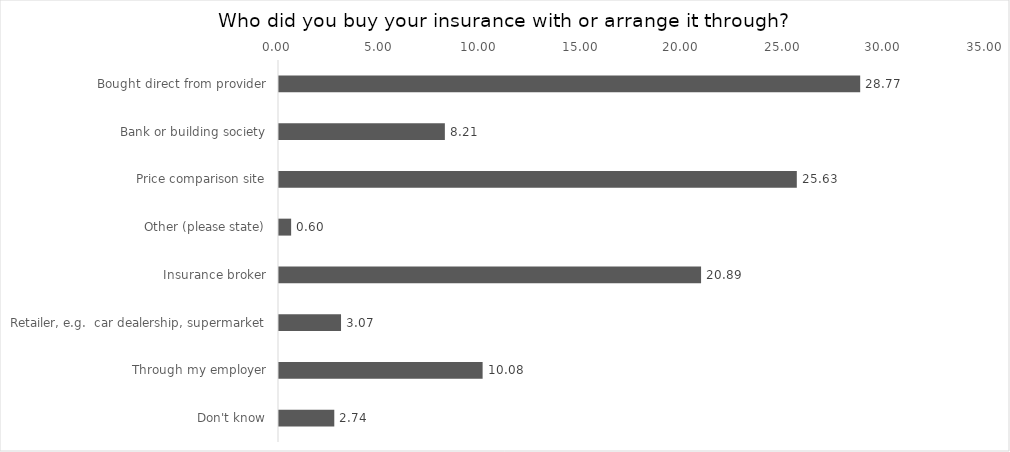
| Category | % of Respondents |
|---|---|
| Bought direct from provider | 28.772 |
| Bank or building society | 8.211 |
| Price comparison site | 25.634 |
| Other (please state) | 0.601 |
| Insurance broker | 20.895 |
| Retailer, e.g.  car dealership, supermarket | 3.071 |
| Through my employer | 10.08 |
| Don't know | 2.737 |